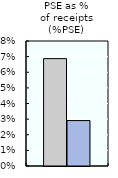
| Category | 2000-02 | 2016-18 |
|---|---|---|
| PSE as %
of receipts (%PSE) | 0.069 | 0.029 |